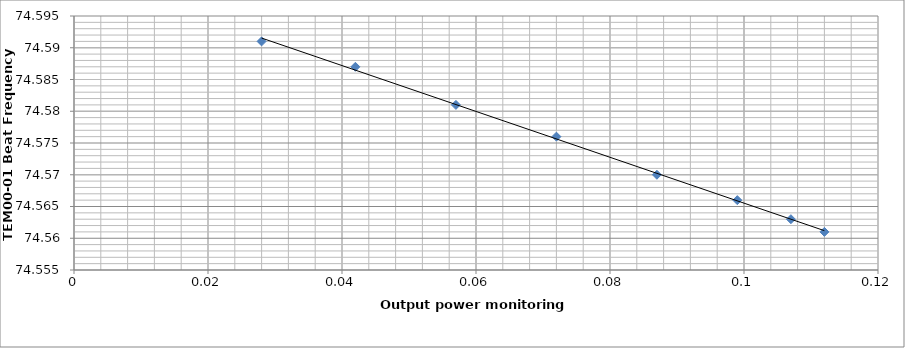
| Category | Series 0 |
|---|---|
| 0.112 | 74.561 |
| 0.107 | 74.563 |
| 0.099 | 74.566 |
| 0.087 | 74.57 |
| 0.072 | 74.576 |
| 0.057 | 74.581 |
| 0.042 | 74.587 |
| 0.028 | 74.591 |